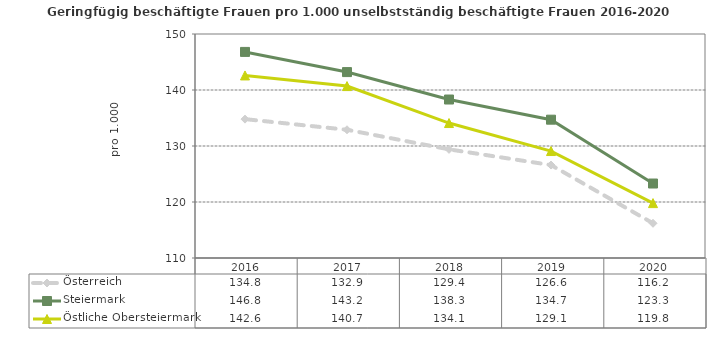
| Category | Österreich | Steiermark | Östliche Obersteiermark |
|---|---|---|---|
| 2020.0 | 116.2 | 123.3 | 119.8 |
| 2019.0 | 126.6 | 134.7 | 129.1 |
| 2018.0 | 129.4 | 138.3 | 134.1 |
| 2017.0 | 132.9 | 143.2 | 140.7 |
| 2016.0 | 134.8 | 146.8 | 142.6 |